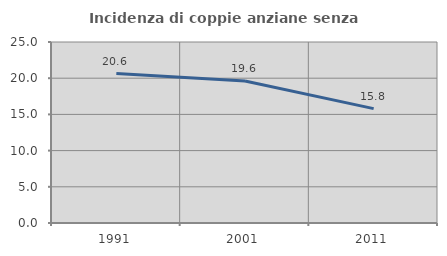
| Category | Incidenza di coppie anziane senza figli  |
|---|---|
| 1991.0 | 20.644 |
| 2001.0 | 19.622 |
| 2011.0 | 15.795 |